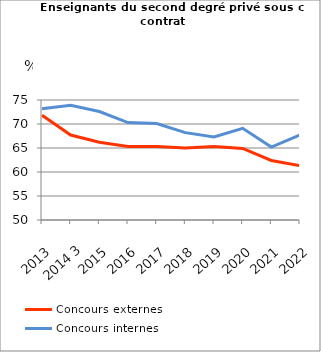
| Category | Concours externes  | Concours internes |
|---|---|---|
| 2013 | 71.8 | 73.2 |
| 2014 3 | 67.7 | 73.9 |
| 2015 | 66.2 | 72.6 |
| 2016 | 65.3 | 70.3 |
| 2017 | 65.3 | 70.1 |
| 2018 | 65 | 68.2 |
| 2019 | 65.3 | 67.3 |
| 2020 | 64.9 | 69.1 |
| 2021 | 62.4 | 65.2 |
| 2022 | 61.3 | 67.7 |